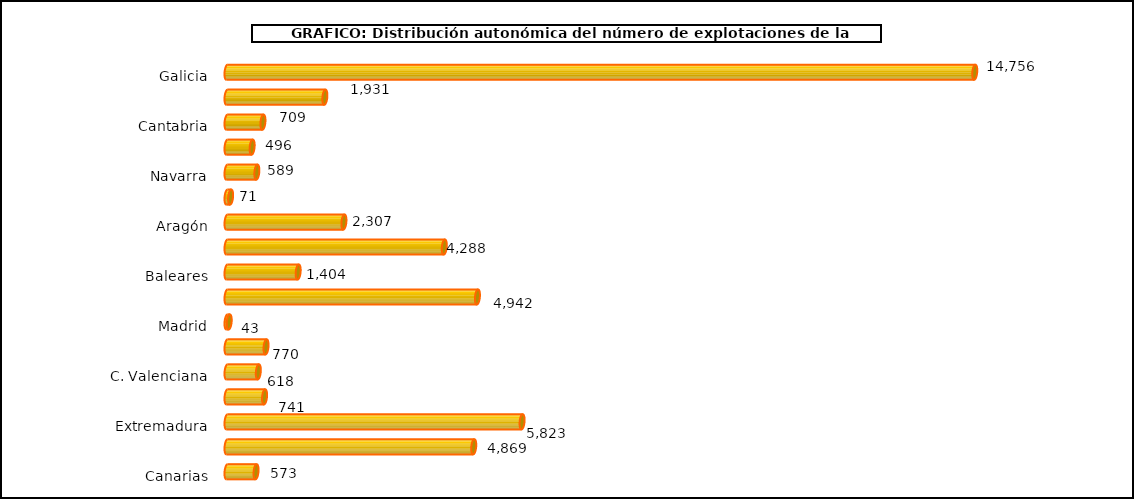
| Category | num. Explotaciones |
|---|---|
| 0 | 14756 |
| 1 | 1931 |
| 2 | 709 |
| 3 | 496 |
| 4 | 589 |
| 5 | 71 |
| 6 | 2307 |
| 7 | 4288 |
| 8 | 1404 |
| 9 | 4942 |
| 10 | 43 |
| 11 | 770 |
| 12 | 618 |
| 13 | 741 |
| 14 | 5823 |
| 15 | 4869 |
| 16 | 573 |